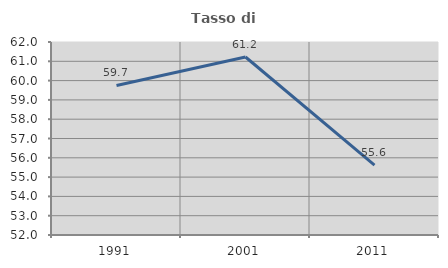
| Category | Tasso di occupazione   |
|---|---|
| 1991.0 | 59.749 |
| 2001.0 | 61.223 |
| 2011.0 | 55.618 |